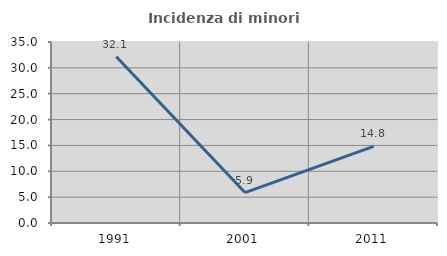
| Category | Incidenza di minori stranieri |
|---|---|
| 1991.0 | 32.143 |
| 2001.0 | 5.882 |
| 2011.0 | 14.815 |